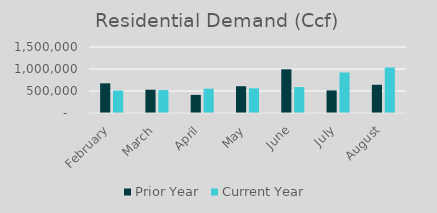
| Category | Prior Year | Current Year |
|---|---|---|
| February | 674439.428 | 510296.309 |
| March | 528549.791 | 521893.674 |
| April | 411179.62 | 552550.404 |
| May | 608563.54 | 561680.927 |
| June | 993563.54 | 588815.728 |
| July | 512849.55 | 920418.723 |
| August | 641515.25 | 1034271.241 |